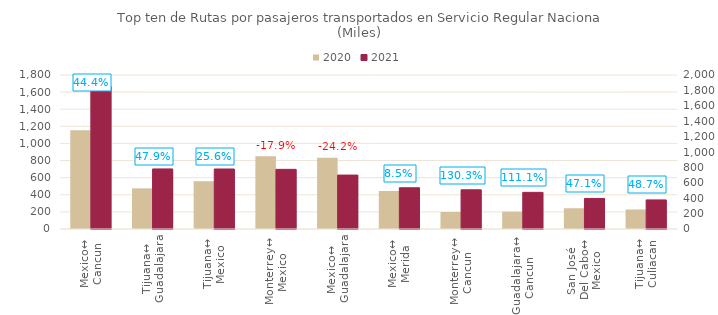
| Category | 2020 | 2021 |
|---|---|---|
| Mexico↔
Cancun | 1153.752 | 1666.338 |
| Tijuana↔
Guadalajara | 474.766 | 702.117 |
| Tijuana↔
Mexico | 558.552 | 701.434 |
| Monterrey↔
Mexico | 849.013 | 697.162 |
| Mexico↔
Guadalajara | 831.447 | 630.238 |
| Mexico↔
Merida | 444.226 | 482.023 |
| Monterrey↔
Cancun | 198.989 | 458.245 |
| Guadalajara↔
Cancun | 202.895 | 428.302 |
| San José 
Del Cabo↔
Mexico | 242.801 | 357.163 |
| Tijuana↔
Culiacan | 228.551 | 339.778 |